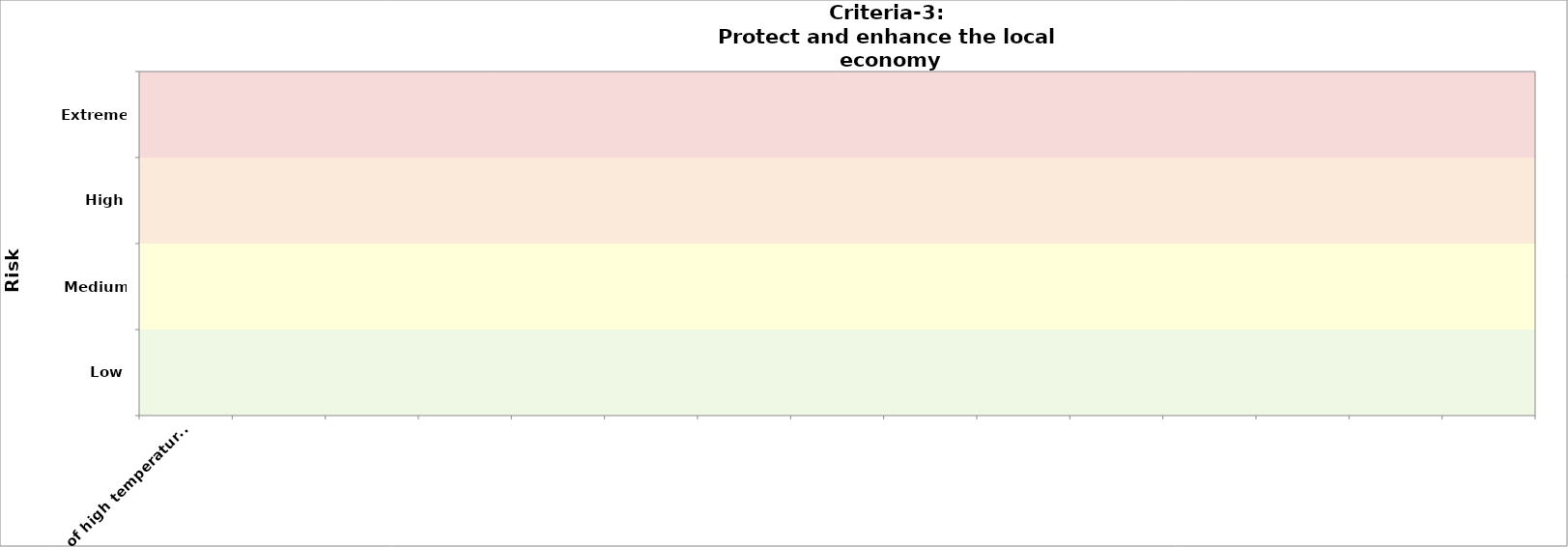
| Category | Criteria-3 (public health) | Criteria-3
2030 |
|---|---|---|
| e.g. effect of high temperature on road pavement  |  | 0 |